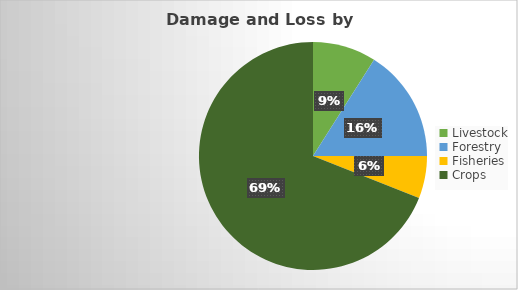
| Category | Series 0 |
|---|---|
| Livestock | 9 |
| Forestry | 16 |
| Fisheries | 6 |
| Crops | 69 |